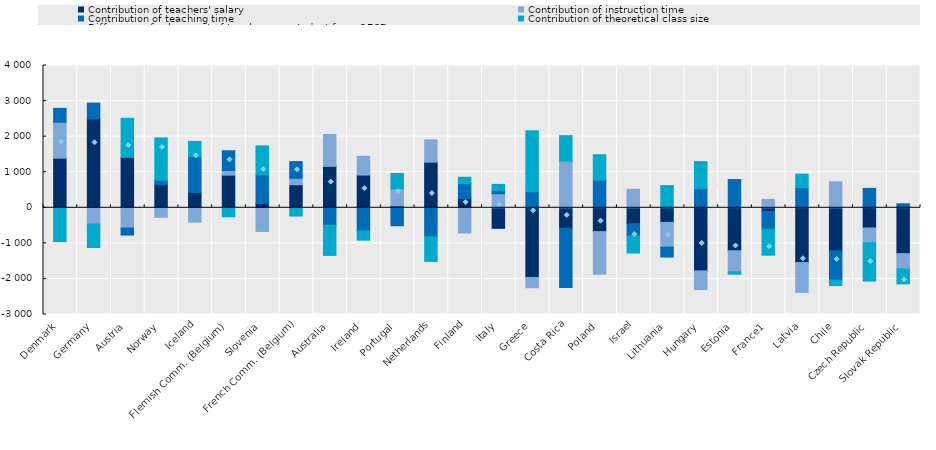
| Category | Contribution of teachers' salary | Contribution of instruction time | Contribution of teaching time | Contribution of theoretical class size |
|---|---|---|---|---|
| Denmark | 1394.91 | 1008.944 | 391.057 | -950.564 |
| Germany | 2496.443 | -458.005 | 446.722 | -657.825 |
| Austria | 1416.329 | -568.722 | -199.001 | 1099.014 |
| Norway | 647.304 | -266.711 | 123.954 | 1192.625 |
| Iceland | 429.04 | -404.304 | 1006.677 | 429.614 |
| Flemish Comm. (Belgium) | 917.098 | 130.62 | 555.415 | -253.351 |
| Slovenia | 121.062 | -665.494 | 808.293 | 810.476 |
| French Comm. (Belgium) | 648.442 | 180.665 | 470.03 | -231.209 |
| Australia | 1165.231 | 896.387 | -488.772 | -850.502 |
| Ireland | 921.187 | 526.3 | -652.356 | -257.481 |
| Portugal | 54.28 | 476.071 | -504.955 | 434.388 |
| Netherlands | 1282.162 | 626.432 | -815.857 | -692.163 |
| Finland | 260.731 | -710.195 | 419.44 | 179.188 |
| Italy | -576.287 | 396.604 | 89.493 | 171.1 |
| Greece | -1957.995 | -291.214 | 451.661 | 1712.072 |
| Costa Rica | -571.269 | 1309.552 | -1670.236 | 718.133 |
| Poland | -670.226 | -1197.14 | 773.599 | 717.285 |
| Israel | -446.364 | 519.734 | -337.957 | -487.336 |
| Lithuania | -409.475 | -697.095 | -278.747 | 623.774 |
| Hungary | -1774.748 | -525.448 | 538.194 | 759.738 |
| Estonia | -1206.982 | -590.798 | 793.085 | -68.772 |
| France1 | -99.155 | 237.206 | -506.337 | -727.413 |
| Latvia | -1540.687 | -837.394 | 563.144 | 381.589 |
| Chile | -1209.996 | 730.912 | -823.524 | -152.812 |
| Czech Republic | -567.136 | -415.63 | 544.424 | -1076.611 |
| Slovak Republic | -1290.232 | -430.705 | 111.278 | -417.681 |